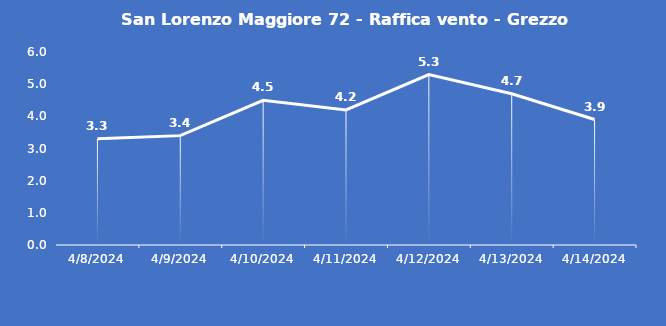
| Category | San Lorenzo Maggiore 72 - Raffica vento - Grezzo (m/s) |
|---|---|
| 4/8/24 | 3.3 |
| 4/9/24 | 3.4 |
| 4/10/24 | 4.5 |
| 4/11/24 | 4.2 |
| 4/12/24 | 5.3 |
| 4/13/24 | 4.7 |
| 4/14/24 | 3.9 |